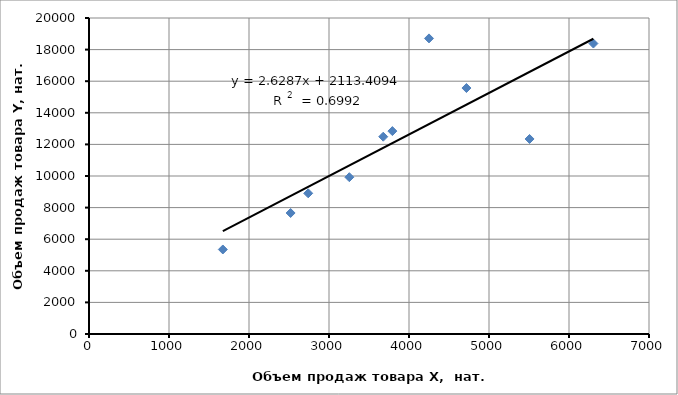
| Category | Series 0 |
|---|---|
| 3792.0 | 12842 |
| 3678.0 | 12487 |
| 6305.0 | 18385 |
| 5507.0 | 12343 |
| 2740.0 | 8905 |
| 4718.0 | 15568 |
| 2520.0 | 7659 |
| 3254.0 | 9925 |
| 4250.0 | 18709 |
| 1673.0 | 5350 |